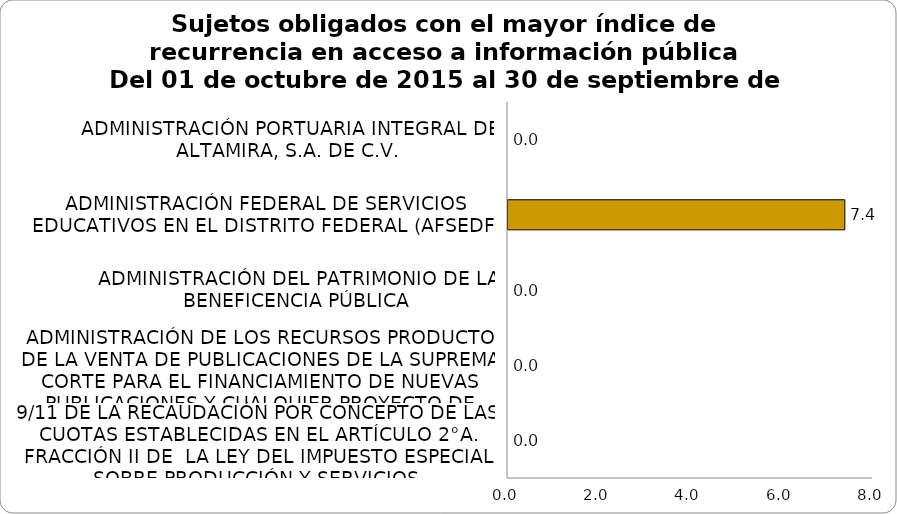
| Category | Series 0 |
|---|---|
| 9/11 DE LA RECAUDACIÓN POR CONCEPTO DE LAS CUOTAS ESTABLECIDAS EN EL ARTÍCULO 2°A. FRACCIÓN II DE  LA LEY DEL IMPUESTO ESPECIAL SOBRE PRODUCCIÓN Y SERVICIOS | 0 |
| ADMINISTRACIÓN DE LOS RECURSOS PRODUCTO DE LA VENTA DE PUBLICACIONES DE LA SUPREMA CORTE PARA EL FINANCIAMIENTO DE NUEVAS PUBLICACIONES Y CUALQUIER PROYECTO DE INTERÉS PARA EL FIDEICOMITENTE | 0 |
| ADMINISTRACIÓN DEL PATRIMONIO DE LA BENEFICENCIA PÚBLICA | 0 |
| ADMINISTRACIÓN FEDERAL DE SERVICIOS EDUCATIVOS EN EL DISTRITO FEDERAL (AFSEDF) | 7.383 |
| ADMINISTRACIÓN PORTUARIA INTEGRAL DE ALTAMIRA, S.A. DE C.V. | 0 |